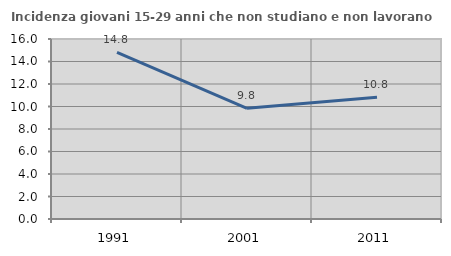
| Category | Incidenza giovani 15-29 anni che non studiano e non lavorano  |
|---|---|
| 1991.0 | 14.805 |
| 2001.0 | 9.843 |
| 2011.0 | 10.817 |